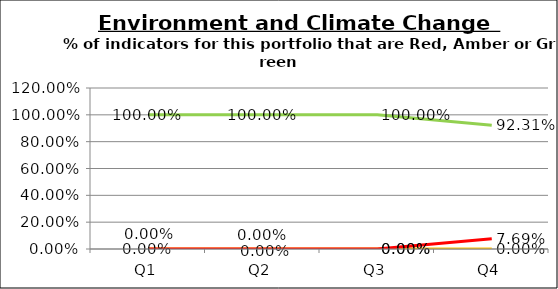
| Category | Green | Amber | Red |
|---|---|---|---|
| Q1 | 1 | 0 | 0 |
| Q2 | 1 | 0 | 0 |
| Q3 | 1 | 0 | 0 |
| Q4 | 0.923 | 0 | 0.077 |